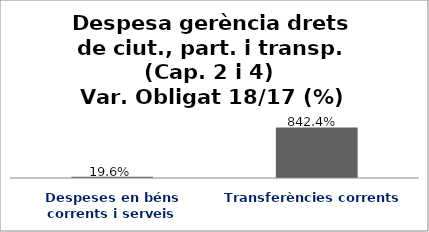
| Category | Series 0 |
|---|---|
| Despeses en béns corrents i serveis | 0.196 |
| Transferències corrents | 8.424 |